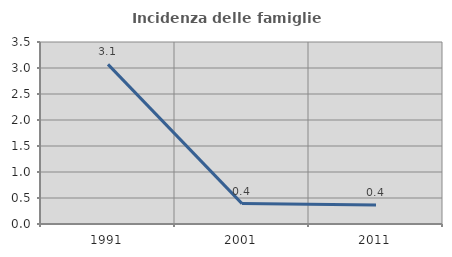
| Category | Incidenza delle famiglie numerose |
|---|---|
| 1991.0 | 3.07 |
| 2001.0 | 0.392 |
| 2011.0 | 0.368 |